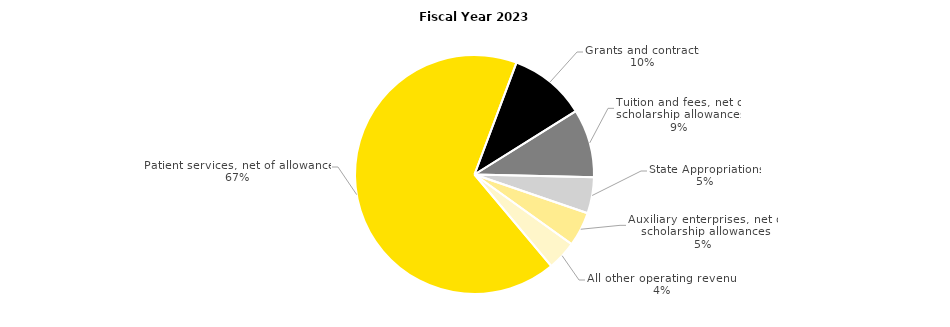
| Category | Series 0 |
|---|---|
| Patient services, net of allowances | 3249 |
| Grants and contracts | 505 |
| Tuition and fees, net of scholarship allowances | 451 |
| State Appropriations | 237 |
| Auxiliary enterprises, net of scholarship allowances | 226 |
| All other operating revenue | 194 |